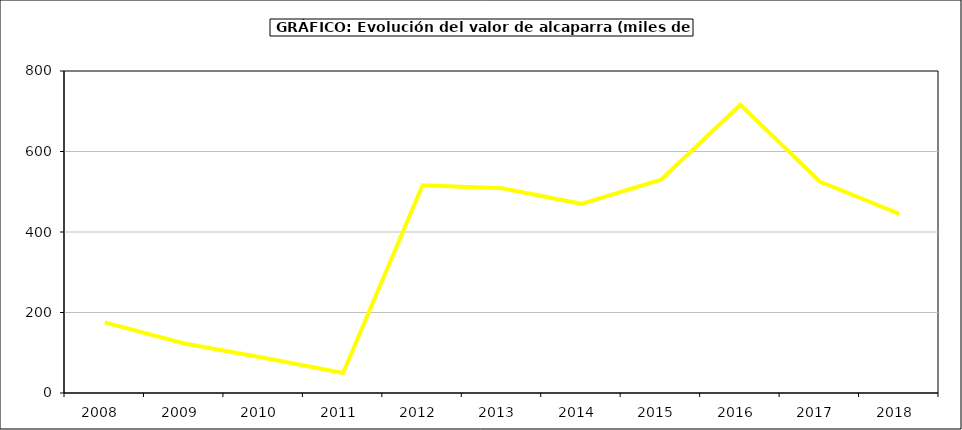
| Category | producción |
|---|---|
| 2008.0 | 175.54 |
| 2009.0 | 123.08 |
| 2010.0 | 87.75 |
| 2011.0 | 49.5 |
| 2012.0 | 516 |
| 2013.0 | 508.5 |
| 2014.0 | 470 |
| 2015.0 | 530 |
| 2016.0 | 716 |
| 2017.0 | 525.442 |
| 2018.0 | 444.946 |